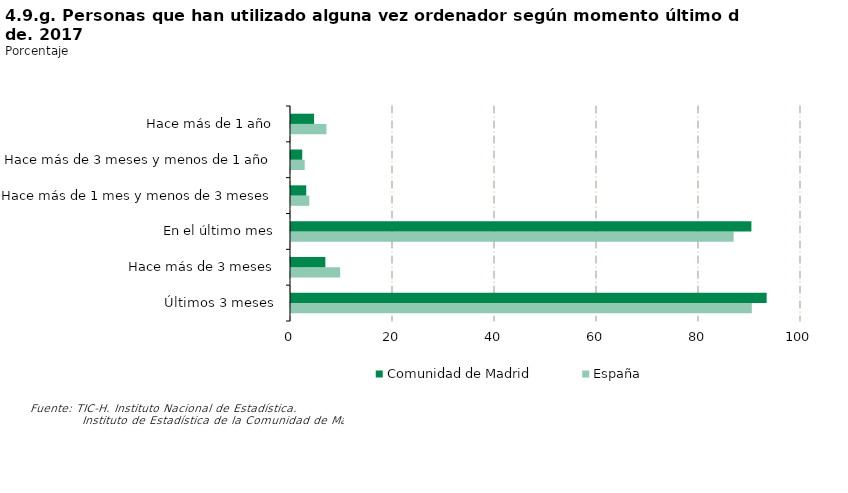
| Category | España | Comunidad de Madrid |
|---|---|---|
| Últimos 3 meses | 90.364 | 93.263 |
| Hace más de 3 meses | 9.636 | 6.737 |
| En el último mes | 86.782 | 90.276 |
| Hace más de 1 mes y menos de 3 meses | 3.582 | 2.987 |
| Hace más de 3 meses y menos de 1 año | 2.685 | 2.205 |
| Hace más de 1 año | 6.951 | 4.532 |